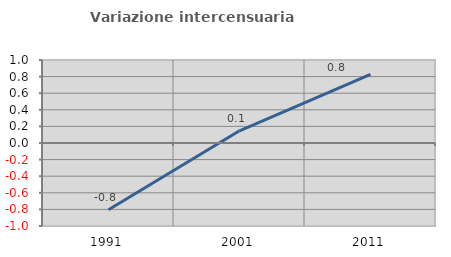
| Category | Variazione intercensuaria annua |
|---|---|
| 1991.0 | -0.804 |
| 2001.0 | 0.147 |
| 2011.0 | 0.826 |